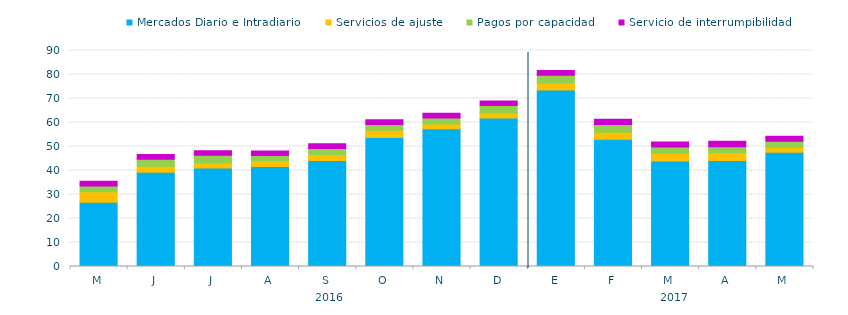
| Category | Mercados Diario e Intradiario  | Servicios de ajuste | Pagos por capacidad | Servicio de interrumpibilidad |
|---|---|---|---|---|
| M | 26.74 | 4.36 | 2.43 | 2.03 |
| J | 39.3 | 2.51 | 2.89 | 2 |
| J | 41.06 | 2.03 | 3.27 | 1.82 |
| A | 41.62 | 2.4 | 2.22 | 1.88 |
| S | 44.17 | 2.46 | 2.54 | 1.94 |
| O | 53.78 | 3 | 2.37 | 2.04 |
| N | 57.41 | 1.93 | 2.55 | 1.95 |
| D | 61.87 | 2.09 | 3.16 | 1.88 |
| E | 73.58 | 2.9 | 3.25 | 1.89 |
| F | 53.05 | 2.84 | 3.26 | 2.19 |
| M | 43.94 | 3.19 | 2.63 | 2.07 |
| A | 44.2 | 3.27 | 2.45 | 2.31 |
| M | 47.6 | 2.12 | 2.43 | 2.17 |